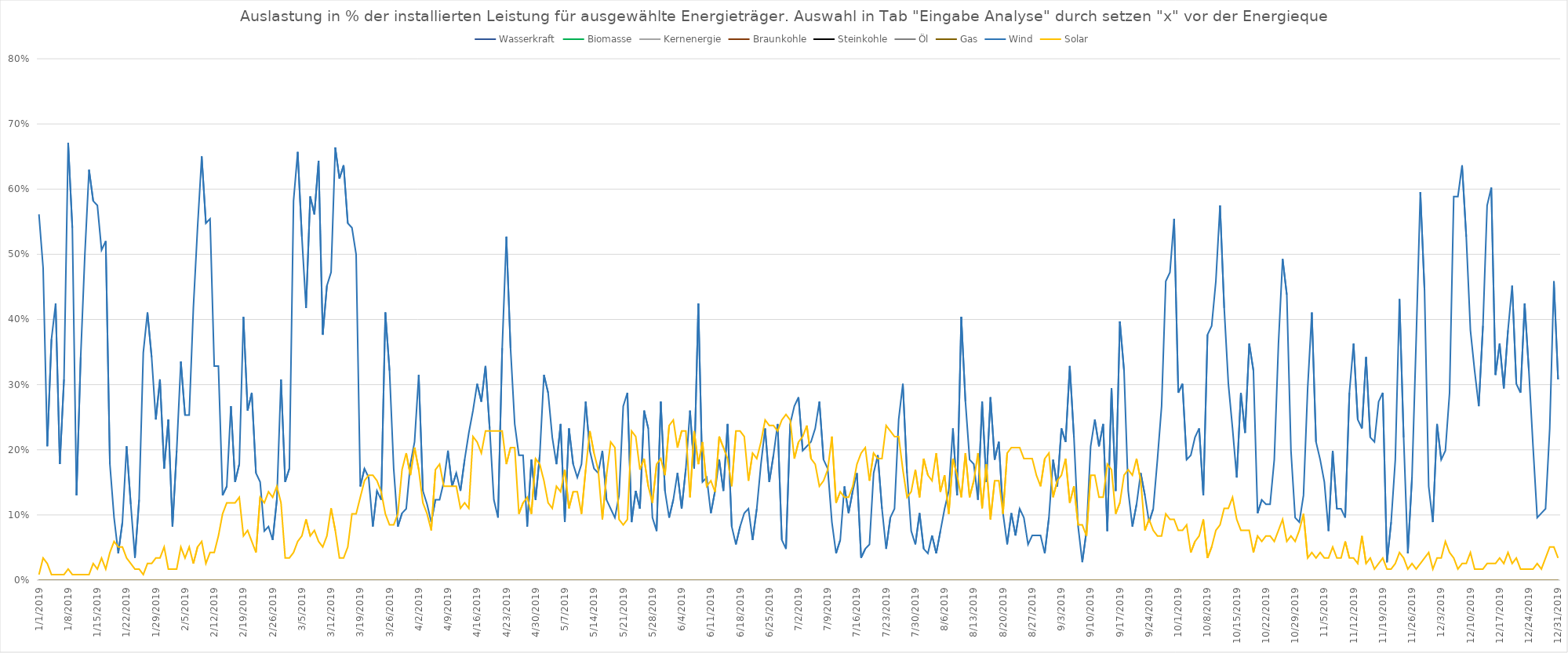
| Category | Wasserkraft | Biomasse | Kernenergie | Braunkohle | Steinkohle | Öl | Gas | Wind | Solar |
|---|---|---|---|---|---|---|---|---|---|
| 1/1/19 | 0 | 0 | 0 | 0 | 0 | 0 | 0 | 0.561 | 0.008 |
| 1/2/19 | 0 | 0 | 0 | 0 | 0 | 0 | 0 | 0.479 | 0.034 |
| 1/3/19 | 0 | 0 | 0 | 0 | 0 | 0 | 0 | 0.205 | 0.025 |
| 1/4/19 | 0 | 0 | 0 | 0 | 0 | 0 | 0 | 0.37 | 0.008 |
| 1/5/19 | 0 | 0 | 0 | 0 | 0 | 0 | 0 | 0.424 | 0.008 |
| 1/6/19 | 0 | 0 | 0 | 0 | 0 | 0 | 0 | 0.178 | 0.008 |
| 1/7/19 | 0 | 0 | 0 | 0 | 0 | 0 | 0 | 0.308 | 0.008 |
| 1/8/19 | 0 | 0 | 0 | 0 | 0 | 0 | 0 | 0.671 | 0.017 |
| 1/9/19 | 0 | 0 | 0 | 0 | 0 | 0 | 0 | 0.541 | 0.008 |
| 1/10/19 | 0 | 0 | 0 | 0 | 0 | 0 | 0 | 0.13 | 0.008 |
| 1/11/19 | 0 | 0 | 0 | 0 | 0 | 0 | 0 | 0.342 | 0.008 |
| 1/12/19 | 0 | 0 | 0 | 0 | 0 | 0 | 0 | 0.5 | 0.008 |
| 1/13/19 | 0 | 0 | 0 | 0 | 0 | 0 | 0 | 0.63 | 0.008 |
| 1/14/19 | 0 | 0 | 0 | 0 | 0 | 0 | 0 | 0.582 | 0.025 |
| 1/15/19 | 0 | 0 | 0 | 0 | 0 | 0 | 0 | 0.575 | 0.017 |
| 1/16/19 | 0 | 0 | 0 | 0 | 0 | 0 | 0 | 0.507 | 0.034 |
| 1/17/19 | 0 | 0 | 0 | 0 | 0 | 0 | 0 | 0.52 | 0.017 |
| 1/18/19 | 0 | 0 | 0 | 0 | 0 | 0 | 0 | 0.178 | 0.042 |
| 1/19/19 | 0 | 0 | 0 | 0 | 0 | 0 | 0 | 0.096 | 0.059 |
| 1/20/19 | 0 | 0 | 0 | 0 | 0 | 0 | 0 | 0.041 | 0.051 |
| 1/21/19 | 0 | 0 | 0 | 0 | 0 | 0 | 0 | 0.089 | 0.051 |
| 1/22/19 | 0 | 0 | 0 | 0 | 0 | 0 | 0 | 0.205 | 0.034 |
| 1/23/19 | 0 | 0 | 0 | 0 | 0 | 0 | 0 | 0.116 | 0.025 |
| 1/24/19 | 0 | 0 | 0 | 0 | 0 | 0 | 0 | 0.034 | 0.017 |
| 1/25/19 | 0 | 0 | 0 | 0 | 0 | 0 | 0 | 0.123 | 0.017 |
| 1/26/19 | 0 | 0 | 0 | 0 | 0 | 0 | 0 | 0.349 | 0.008 |
| 1/27/19 | 0 | 0 | 0 | 0 | 0 | 0 | 0 | 0.411 | 0.025 |
| 1/28/19 | 0 | 0 | 0 | 0 | 0 | 0 | 0 | 0.342 | 0.025 |
| 1/29/19 | 0 | 0 | 0 | 0 | 0 | 0 | 0 | 0.246 | 0.034 |
| 1/30/19 | 0 | 0 | 0 | 0 | 0 | 0 | 0 | 0.308 | 0.034 |
| 1/31/19 | 0 | 0 | 0 | 0 | 0 | 0 | 0 | 0.171 | 0.051 |
| 2/1/19 | 0 | 0 | 0 | 0 | 0 | 0 | 0 | 0.246 | 0.017 |
| 2/2/19 | 0 | 0 | 0 | 0 | 0 | 0 | 0 | 0.082 | 0.017 |
| 2/3/19 | 0 | 0 | 0 | 0 | 0 | 0 | 0 | 0.199 | 0.017 |
| 2/4/19 | 0 | 0 | 0 | 0 | 0 | 0 | 0 | 0.335 | 0.051 |
| 2/5/19 | 0 | 0 | 0 | 0 | 0 | 0 | 0 | 0.253 | 0.034 |
| 2/6/19 | 0 | 0 | 0 | 0 | 0 | 0 | 0 | 0.253 | 0.051 |
| 2/7/19 | 0 | 0 | 0 | 0 | 0 | 0 | 0 | 0.418 | 0.025 |
| 2/8/19 | 0 | 0 | 0 | 0 | 0 | 0 | 0 | 0.541 | 0.051 |
| 2/9/19 | 0 | 0 | 0 | 0 | 0 | 0 | 0 | 0.65 | 0.059 |
| 2/10/19 | 0 | 0 | 0 | 0 | 0 | 0 | 0 | 0.548 | 0.025 |
| 2/11/19 | 0 | 0 | 0 | 0 | 0 | 0 | 0 | 0.554 | 0.042 |
| 2/12/19 | 0 | 0 | 0 | 0 | 0 | 0 | 0 | 0.329 | 0.042 |
| 2/13/19 | 0 | 0 | 0 | 0 | 0 | 0 | 0 | 0.329 | 0.068 |
| 2/14/19 | 0 | 0 | 0 | 0 | 0 | 0 | 0 | 0.13 | 0.102 |
| 2/15/19 | 0 | 0 | 0 | 0 | 0 | 0 | 0 | 0.144 | 0.119 |
| 2/16/19 | 0 | 0 | 0 | 0 | 0 | 0 | 0 | 0.267 | 0.119 |
| 2/17/19 | 0 | 0 | 0 | 0 | 0 | 0 | 0 | 0.151 | 0.119 |
| 2/18/19 | 0 | 0 | 0 | 0 | 0 | 0 | 0 | 0.178 | 0.127 |
| 2/19/19 | 0 | 0 | 0 | 0 | 0 | 0 | 0 | 0.404 | 0.068 |
| 2/20/19 | 0 | 0 | 0 | 0 | 0 | 0 | 0 | 0.26 | 0.076 |
| 2/21/19 | 0 | 0 | 0 | 0 | 0 | 0 | 0 | 0.287 | 0.059 |
| 2/22/19 | 0 | 0 | 0 | 0 | 0 | 0 | 0 | 0.164 | 0.042 |
| 2/23/19 | 0 | 0 | 0 | 0 | 0 | 0 | 0 | 0.151 | 0.127 |
| 2/24/19 | 0 | 0 | 0 | 0 | 0 | 0 | 0 | 0.075 | 0.119 |
| 2/25/19 | 0 | 0 | 0 | 0 | 0 | 0 | 0 | 0.082 | 0.136 |
| 2/26/19 | 0 | 0 | 0 | 0 | 0 | 0 | 0 | 0.062 | 0.127 |
| 2/27/19 | 0 | 0 | 0 | 0 | 0 | 0 | 0 | 0.123 | 0.144 |
| 2/28/19 | 0 | 0 | 0 | 0 | 0 | 0 | 0 | 0.308 | 0.119 |
| 3/1/19 | 0 | 0 | 0 | 0 | 0 | 0 | 0 | 0.151 | 0.034 |
| 3/2/19 | 0 | 0 | 0 | 0 | 0 | 0 | 0 | 0.171 | 0.034 |
| 3/3/19 | 0 | 0 | 0 | 0 | 0 | 0 | 0 | 0.582 | 0.042 |
| 3/4/19 | 0 | 0 | 0 | 0 | 0 | 0 | 0 | 0.657 | 0.059 |
| 3/5/19 | 0 | 0 | 0 | 0 | 0 | 0 | 0 | 0.527 | 0.068 |
| 3/6/19 | 0 | 0 | 0 | 0 | 0 | 0 | 0 | 0.418 | 0.093 |
| 3/7/19 | 0 | 0 | 0 | 0 | 0 | 0 | 0 | 0.589 | 0.068 |
| 3/8/19 | 0 | 0 | 0 | 0 | 0 | 0 | 0 | 0.561 | 0.076 |
| 3/9/19 | 0 | 0 | 0 | 0 | 0 | 0 | 0 | 0.643 | 0.059 |
| 3/10/19 | 0 | 0 | 0 | 0 | 0 | 0 | 0 | 0.376 | 0.051 |
| 3/11/19 | 0 | 0 | 0 | 0 | 0 | 0 | 0 | 0.452 | 0.068 |
| 3/12/19 | 0 | 0 | 0 | 0 | 0 | 0 | 0 | 0.472 | 0.11 |
| 3/13/19 | 0 | 0 | 0 | 0 | 0 | 0 | 0 | 0.664 | 0.076 |
| 3/14/19 | 0 | 0 | 0 | 0 | 0 | 0 | 0 | 0.616 | 0.034 |
| 3/15/19 | 0 | 0 | 0 | 0 | 0 | 0 | 0 | 0.637 | 0.034 |
| 3/16/19 | 0 | 0 | 0 | 0 | 0 | 0 | 0 | 0.548 | 0.051 |
| 3/17/19 | 0 | 0 | 0 | 0 | 0 | 0 | 0 | 0.541 | 0.102 |
| 3/18/19 | 0 | 0 | 0 | 0 | 0 | 0 | 0 | 0.5 | 0.102 |
| 3/19/19 | 0 | 0 | 0 | 0 | 0 | 0 | 0 | 0.144 | 0.127 |
| 3/20/19 | 0 | 0 | 0 | 0 | 0 | 0 | 0 | 0.171 | 0.153 |
| 3/21/19 | 0 | 0 | 0 | 0 | 0 | 0 | 0 | 0.157 | 0.161 |
| 3/22/19 | 0 | 0 | 0 | 0 | 0 | 0 | 0 | 0.082 | 0.161 |
| 3/23/19 | 0 | 0 | 0 | 0 | 0 | 0 | 0 | 0.137 | 0.153 |
| 3/24/19 | 0 | 0 | 0 | 0 | 0 | 0 | 0 | 0.123 | 0.136 |
| 3/25/19 | 0 | 0 | 0 | 0 | 0 | 0 | 0 | 0.411 | 0.102 |
| 3/26/19 | 0 | 0 | 0 | 0 | 0 | 0 | 0 | 0.322 | 0.085 |
| 3/27/19 | 0 | 0 | 0 | 0 | 0 | 0 | 0 | 0.171 | 0.085 |
| 3/28/19 | 0 | 0 | 0 | 0 | 0 | 0 | 0 | 0.082 | 0.102 |
| 3/29/19 | 0 | 0 | 0 | 0 | 0 | 0 | 0 | 0.103 | 0.169 |
| 3/30/19 | 0 | 0 | 0 | 0 | 0 | 0 | 0 | 0.11 | 0.195 |
| 3/31/19 | 0 | 0 | 0 | 0 | 0 | 0 | 0 | 0.178 | 0.161 |
| 4/1/19 | 0 | 0 | 0 | 0 | 0 | 0 | 0 | 0.212 | 0.203 |
| 4/2/19 | 0 | 0 | 0 | 0 | 0 | 0 | 0 | 0.315 | 0.169 |
| 4/3/19 | 0 | 0 | 0 | 0 | 0 | 0 | 0 | 0.137 | 0.119 |
| 4/4/19 | 0 | 0 | 0 | 0 | 0 | 0 | 0 | 0.116 | 0.102 |
| 4/5/19 | 0 | 0 | 0 | 0 | 0 | 0 | 0 | 0.089 | 0.076 |
| 4/6/19 | 0 | 0 | 0 | 0 | 0 | 0 | 0 | 0.123 | 0.169 |
| 4/7/19 | 0 | 0 | 0 | 0 | 0 | 0 | 0 | 0.123 | 0.178 |
| 4/8/19 | 0 | 0 | 0 | 0 | 0 | 0 | 0 | 0.151 | 0.144 |
| 4/9/19 | 0 | 0 | 0 | 0 | 0 | 0 | 0 | 0.199 | 0.144 |
| 4/10/19 | 0 | 0 | 0 | 0 | 0 | 0 | 0 | 0.144 | 0.144 |
| 4/11/19 | 0 | 0 | 0 | 0 | 0 | 0 | 0 | 0.164 | 0.144 |
| 4/12/19 | 0 | 0 | 0 | 0 | 0 | 0 | 0 | 0.137 | 0.11 |
| 4/13/19 | 0 | 0 | 0 | 0 | 0 | 0 | 0 | 0.185 | 0.119 |
| 4/14/19 | 0 | 0 | 0 | 0 | 0 | 0 | 0 | 0.226 | 0.11 |
| 4/15/19 | 0 | 0 | 0 | 0 | 0 | 0 | 0 | 0.26 | 0.22 |
| 4/16/19 | 0 | 0 | 0 | 0 | 0 | 0 | 0 | 0.301 | 0.212 |
| 4/17/19 | 0 | 0 | 0 | 0 | 0 | 0 | 0 | 0.274 | 0.195 |
| 4/18/19 | 0 | 0 | 0 | 0 | 0 | 0 | 0 | 0.329 | 0.229 |
| 4/19/19 | 0 | 0 | 0 | 0 | 0 | 0 | 0 | 0.233 | 0.229 |
| 4/20/19 | 0 | 0 | 0 | 0 | 0 | 0 | 0 | 0.123 | 0.229 |
| 4/21/19 | 0 | 0 | 0 | 0 | 0 | 0 | 0 | 0.096 | 0.229 |
| 4/22/19 | 0 | 0 | 0 | 0 | 0 | 0 | 0 | 0.356 | 0.229 |
| 4/23/19 | 0 | 0 | 0 | 0 | 0 | 0 | 0 | 0.527 | 0.178 |
| 4/24/19 | 0 | 0 | 0 | 0 | 0 | 0 | 0 | 0.356 | 0.203 |
| 4/25/19 | 0 | 0 | 0 | 0 | 0 | 0 | 0 | 0.24 | 0.203 |
| 4/26/19 | 0 | 0 | 0 | 0 | 0 | 0 | 0 | 0.192 | 0.102 |
| 4/27/19 | 0 | 0 | 0 | 0 | 0 | 0 | 0 | 0.192 | 0.119 |
| 4/28/19 | 0 | 0 | 0 | 0 | 0 | 0 | 0 | 0.082 | 0.127 |
| 4/29/19 | 0 | 0 | 0 | 0 | 0 | 0 | 0 | 0.185 | 0.102 |
| 4/30/19 | 0 | 0 | 0 | 0 | 0 | 0 | 0 | 0.123 | 0.186 |
| 5/1/19 | 0 | 0 | 0 | 0 | 0 | 0 | 0 | 0.192 | 0.178 |
| 5/2/19 | 0 | 0 | 0 | 0 | 0 | 0 | 0 | 0.315 | 0.153 |
| 5/3/19 | 0 | 0 | 0 | 0 | 0 | 0 | 0 | 0.287 | 0.119 |
| 5/4/19 | 0 | 0 | 0 | 0 | 0 | 0 | 0 | 0.219 | 0.11 |
| 5/5/19 | 0 | 0 | 0 | 0 | 0 | 0 | 0 | 0.178 | 0.144 |
| 5/6/19 | 0 | 0 | 0 | 0 | 0 | 0 | 0 | 0.24 | 0.136 |
| 5/7/19 | 0 | 0 | 0 | 0 | 0 | 0 | 0 | 0.089 | 0.169 |
| 5/8/19 | 0 | 0 | 0 | 0 | 0 | 0 | 0 | 0.233 | 0.11 |
| 5/9/19 | 0 | 0 | 0 | 0 | 0 | 0 | 0 | 0.178 | 0.136 |
| 5/10/19 | 0 | 0 | 0 | 0 | 0 | 0 | 0 | 0.157 | 0.136 |
| 5/11/19 | 0 | 0 | 0 | 0 | 0 | 0 | 0 | 0.178 | 0.102 |
| 5/12/19 | 0 | 0 | 0 | 0 | 0 | 0 | 0 | 0.274 | 0.169 |
| 5/13/19 | 0 | 0 | 0 | 0 | 0 | 0 | 0 | 0.199 | 0.229 |
| 5/14/19 | 0 | 0 | 0 | 0 | 0 | 0 | 0 | 0.171 | 0.195 |
| 5/15/19 | 0 | 0 | 0 | 0 | 0 | 0 | 0 | 0.164 | 0.169 |
| 5/16/19 | 0 | 0 | 0 | 0 | 0 | 0 | 0 | 0.199 | 0.093 |
| 5/17/19 | 0 | 0 | 0 | 0 | 0 | 0 | 0 | 0.123 | 0.161 |
| 5/18/19 | 0 | 0 | 0 | 0 | 0 | 0 | 0 | 0.11 | 0.212 |
| 5/19/19 | 0 | 0 | 0 | 0 | 0 | 0 | 0 | 0.096 | 0.203 |
| 5/20/19 | 0 | 0 | 0 | 0 | 0 | 0 | 0 | 0.13 | 0.093 |
| 5/21/19 | 0 | 0 | 0 | 0 | 0 | 0 | 0 | 0.267 | 0.085 |
| 5/22/19 | 0 | 0 | 0 | 0 | 0 | 0 | 0 | 0.287 | 0.093 |
| 5/23/19 | 0 | 0 | 0 | 0 | 0 | 0 | 0 | 0.089 | 0.229 |
| 5/24/19 | 0 | 0 | 0 | 0 | 0 | 0 | 0 | 0.137 | 0.22 |
| 5/25/19 | 0 | 0 | 0 | 0 | 0 | 0 | 0 | 0.11 | 0.169 |
| 5/26/19 | 0 | 0 | 0 | 0 | 0 | 0 | 0 | 0.26 | 0.186 |
| 5/27/19 | 0 | 0 | 0 | 0 | 0 | 0 | 0 | 0.233 | 0.144 |
| 5/28/19 | 0 | 0 | 0 | 0 | 0 | 0 | 0 | 0.096 | 0.119 |
| 5/29/19 | 0 | 0 | 0 | 0 | 0 | 0 | 0 | 0.075 | 0.178 |
| 5/30/19 | 0 | 0 | 0 | 0 | 0 | 0 | 0 | 0.274 | 0.186 |
| 5/31/19 | 0 | 0 | 0 | 0 | 0 | 0 | 0 | 0.137 | 0.161 |
| 6/1/19 | 0 | 0 | 0 | 0 | 0 | 0 | 0 | 0.096 | 0.237 |
| 6/2/19 | 0 | 0 | 0 | 0 | 0 | 0 | 0 | 0.123 | 0.246 |
| 6/3/19 | 0 | 0 | 0 | 0 | 0 | 0 | 0 | 0.164 | 0.203 |
| 6/4/19 | 0 | 0 | 0 | 0 | 0 | 0 | 0 | 0.11 | 0.229 |
| 6/5/19 | 0 | 0 | 0 | 0 | 0 | 0 | 0 | 0.171 | 0.229 |
| 6/6/19 | 0 | 0 | 0 | 0 | 0 | 0 | 0 | 0.26 | 0.127 |
| 6/7/19 | 0 | 0 | 0 | 0 | 0 | 0 | 0 | 0.171 | 0.229 |
| 6/8/19 | 0 | 0 | 0 | 0 | 0 | 0 | 0 | 0.424 | 0.178 |
| 6/9/19 | 0 | 0 | 0 | 0 | 0 | 0 | 0 | 0.151 | 0.212 |
| 6/10/19 | 0 | 0 | 0 | 0 | 0 | 0 | 0 | 0.157 | 0.144 |
| 6/11/19 | 0 | 0 | 0 | 0 | 0 | 0 | 0 | 0.103 | 0.153 |
| 6/12/19 | 0 | 0 | 0 | 0 | 0 | 0 | 0 | 0.137 | 0.136 |
| 6/13/19 | 0 | 0 | 0 | 0 | 0 | 0 | 0 | 0.185 | 0.22 |
| 6/14/19 | 0 | 0 | 0 | 0 | 0 | 0 | 0 | 0.137 | 0.203 |
| 6/15/19 | 0 | 0 | 0 | 0 | 0 | 0 | 0 | 0.24 | 0.186 |
| 6/16/19 | 0 | 0 | 0 | 0 | 0 | 0 | 0 | 0.082 | 0.144 |
| 6/17/19 | 0 | 0 | 0 | 0 | 0 | 0 | 0 | 0.055 | 0.229 |
| 6/18/19 | 0 | 0 | 0 | 0 | 0 | 0 | 0 | 0.082 | 0.229 |
| 6/19/19 | 0 | 0 | 0 | 0 | 0 | 0 | 0 | 0.103 | 0.22 |
| 6/20/19 | 0 | 0 | 0 | 0 | 0 | 0 | 0 | 0.11 | 0.153 |
| 6/21/19 | 0 | 0 | 0 | 0 | 0 | 0 | 0 | 0.062 | 0.195 |
| 6/22/19 | 0 | 0 | 0 | 0 | 0 | 0 | 0 | 0.11 | 0.186 |
| 6/23/19 | 0 | 0 | 0 | 0 | 0 | 0 | 0 | 0.178 | 0.212 |
| 6/24/19 | 0 | 0 | 0 | 0 | 0 | 0 | 0 | 0.233 | 0.246 |
| 6/25/19 | 0 | 0 | 0 | 0 | 0 | 0 | 0 | 0.151 | 0.237 |
| 6/26/19 | 0 | 0 | 0 | 0 | 0 | 0 | 0 | 0.192 | 0.237 |
| 6/27/19 | 0 | 0 | 0 | 0 | 0 | 0 | 0 | 0.24 | 0.229 |
| 6/28/19 | 0 | 0 | 0 | 0 | 0 | 0 | 0 | 0.062 | 0.246 |
| 6/29/19 | 0 | 0 | 0 | 0 | 0 | 0 | 0 | 0.048 | 0.254 |
| 6/30/19 | 0 | 0 | 0 | 0 | 0 | 0 | 0 | 0.24 | 0.246 |
| 7/1/19 | 0 | 0 | 0 | 0 | 0 | 0 | 0 | 0.267 | 0.186 |
| 7/2/19 | 0 | 0 | 0 | 0 | 0 | 0 | 0 | 0.281 | 0.212 |
| 7/3/19 | 0 | 0 | 0 | 0 | 0 | 0 | 0 | 0.199 | 0.22 |
| 7/4/19 | 0 | 0 | 0 | 0 | 0 | 0 | 0 | 0.205 | 0.237 |
| 7/5/19 | 0 | 0 | 0 | 0 | 0 | 0 | 0 | 0.212 | 0.186 |
| 7/6/19 | 0 | 0 | 0 | 0 | 0 | 0 | 0 | 0.233 | 0.178 |
| 7/7/19 | 0 | 0 | 0 | 0 | 0 | 0 | 0 | 0.274 | 0.144 |
| 7/8/19 | 0 | 0 | 0 | 0 | 0 | 0 | 0 | 0.185 | 0.153 |
| 7/9/19 | 0 | 0 | 0 | 0 | 0 | 0 | 0 | 0.171 | 0.169 |
| 7/10/19 | 0 | 0 | 0 | 0 | 0 | 0 | 0 | 0.089 | 0.22 |
| 7/11/19 | 0 | 0 | 0 | 0 | 0 | 0 | 0 | 0.041 | 0.119 |
| 7/12/19 | 0 | 0 | 0 | 0 | 0 | 0 | 0 | 0.062 | 0.136 |
| 7/13/19 | 0 | 0 | 0 | 0 | 0 | 0 | 0 | 0.144 | 0.127 |
| 7/14/19 | 0 | 0 | 0 | 0 | 0 | 0 | 0 | 0.103 | 0.127 |
| 7/15/19 | 0 | 0 | 0 | 0 | 0 | 0 | 0 | 0.137 | 0.144 |
| 7/16/19 | 0 | 0 | 0 | 0 | 0 | 0 | 0 | 0.164 | 0.178 |
| 7/17/19 | 0 | 0 | 0 | 0 | 0 | 0 | 0 | 0.034 | 0.195 |
| 7/18/19 | 0 | 0 | 0 | 0 | 0 | 0 | 0 | 0.048 | 0.203 |
| 7/19/19 | 0 | 0 | 0 | 0 | 0 | 0 | 0 | 0.055 | 0.153 |
| 7/20/19 | 0 | 0 | 0 | 0 | 0 | 0 | 0 | 0.164 | 0.195 |
| 7/21/19 | 0 | 0 | 0 | 0 | 0 | 0 | 0 | 0.192 | 0.186 |
| 7/22/19 | 0 | 0 | 0 | 0 | 0 | 0 | 0 | 0.11 | 0.186 |
| 7/23/19 | 0 | 0 | 0 | 0 | 0 | 0 | 0 | 0.048 | 0.237 |
| 7/24/19 | 0 | 0 | 0 | 0 | 0 | 0 | 0 | 0.096 | 0.229 |
| 7/25/19 | 0 | 0 | 0 | 0 | 0 | 0 | 0 | 0.11 | 0.22 |
| 7/26/19 | 0 | 0 | 0 | 0 | 0 | 0 | 0 | 0.246 | 0.22 |
| 7/27/19 | 0 | 0 | 0 | 0 | 0 | 0 | 0 | 0.301 | 0.169 |
| 7/28/19 | 0 | 0 | 0 | 0 | 0 | 0 | 0 | 0.164 | 0.127 |
| 7/29/19 | 0 | 0 | 0 | 0 | 0 | 0 | 0 | 0.075 | 0.136 |
| 7/30/19 | 0 | 0 | 0 | 0 | 0 | 0 | 0 | 0.055 | 0.169 |
| 7/31/19 | 0 | 0 | 0 | 0 | 0 | 0 | 0 | 0.103 | 0.127 |
| 8/1/19 | 0 | 0 | 0 | 0 | 0 | 0 | 0 | 0.048 | 0.186 |
| 8/2/19 | 0 | 0 | 0 | 0 | 0 | 0 | 0 | 0.041 | 0.161 |
| 8/3/19 | 0 | 0 | 0 | 0 | 0 | 0 | 0 | 0.068 | 0.153 |
| 8/4/19 | 0 | 0 | 0 | 0 | 0 | 0 | 0 | 0.041 | 0.195 |
| 8/5/19 | 0 | 0 | 0 | 0 | 0 | 0 | 0 | 0.075 | 0.136 |
| 8/6/19 | 0 | 0 | 0 | 0 | 0 | 0 | 0 | 0.11 | 0.161 |
| 8/7/19 | 0 | 0 | 0 | 0 | 0 | 0 | 0 | 0.137 | 0.102 |
| 8/8/19 | 0 | 0 | 0 | 0 | 0 | 0 | 0 | 0.233 | 0.186 |
| 8/9/19 | 0 | 0 | 0 | 0 | 0 | 0 | 0 | 0.13 | 0.161 |
| 8/10/19 | 0 | 0 | 0 | 0 | 0 | 0 | 0 | 0.404 | 0.127 |
| 8/11/19 | 0 | 0 | 0 | 0 | 0 | 0 | 0 | 0.274 | 0.195 |
| 8/12/19 | 0 | 0 | 0 | 0 | 0 | 0 | 0 | 0.185 | 0.127 |
| 8/13/19 | 0 | 0 | 0 | 0 | 0 | 0 | 0 | 0.178 | 0.153 |
| 8/14/19 | 0 | 0 | 0 | 0 | 0 | 0 | 0 | 0.123 | 0.195 |
| 8/15/19 | 0 | 0 | 0 | 0 | 0 | 0 | 0 | 0.274 | 0.11 |
| 8/16/19 | 0 | 0 | 0 | 0 | 0 | 0 | 0 | 0.151 | 0.178 |
| 8/17/19 | 0 | 0 | 0 | 0 | 0 | 0 | 0 | 0.281 | 0.093 |
| 8/18/19 | 0 | 0 | 0 | 0 | 0 | 0 | 0 | 0.185 | 0.153 |
| 8/19/19 | 0 | 0 | 0 | 0 | 0 | 0 | 0 | 0.212 | 0.153 |
| 8/20/19 | 0 | 0 | 0 | 0 | 0 | 0 | 0 | 0.103 | 0.102 |
| 8/21/19 | 0 | 0 | 0 | 0 | 0 | 0 | 0 | 0.055 | 0.195 |
| 8/22/19 | 0 | 0 | 0 | 0 | 0 | 0 | 0 | 0.103 | 0.203 |
| 8/23/19 | 0 | 0 | 0 | 0 | 0 | 0 | 0 | 0.068 | 0.203 |
| 8/24/19 | 0 | 0 | 0 | 0 | 0 | 0 | 0 | 0.11 | 0.203 |
| 8/25/19 | 0 | 0 | 0 | 0 | 0 | 0 | 0 | 0.096 | 0.186 |
| 8/26/19 | 0 | 0 | 0 | 0 | 0 | 0 | 0 | 0.055 | 0.186 |
| 8/27/19 | 0 | 0 | 0 | 0 | 0 | 0 | 0 | 0.068 | 0.186 |
| 8/28/19 | 0 | 0 | 0 | 0 | 0 | 0 | 0 | 0.068 | 0.161 |
| 8/29/19 | 0 | 0 | 0 | 0 | 0 | 0 | 0 | 0.068 | 0.144 |
| 8/30/19 | 0 | 0 | 0 | 0 | 0 | 0 | 0 | 0.041 | 0.186 |
| 8/31/19 | 0 | 0 | 0 | 0 | 0 | 0 | 0 | 0.096 | 0.195 |
| 9/1/19 | 0 | 0 | 0 | 0 | 0 | 0 | 0 | 0.185 | 0.127 |
| 9/2/19 | 0 | 0 | 0 | 0 | 0 | 0 | 0 | 0.144 | 0.153 |
| 9/3/19 | 0 | 0 | 0 | 0 | 0 | 0 | 0 | 0.233 | 0.161 |
| 9/4/19 | 0 | 0 | 0 | 0 | 0 | 0 | 0 | 0.212 | 0.186 |
| 9/5/19 | 0 | 0 | 0 | 0 | 0 | 0 | 0 | 0.329 | 0.119 |
| 9/6/19 | 0 | 0 | 0 | 0 | 0 | 0 | 0 | 0.219 | 0.144 |
| 9/7/19 | 0 | 0 | 0 | 0 | 0 | 0 | 0 | 0.082 | 0.085 |
| 9/8/19 | 0 | 0 | 0 | 0 | 0 | 0 | 0 | 0.027 | 0.085 |
| 9/9/19 | 0 | 0 | 0 | 0 | 0 | 0 | 0 | 0.075 | 0.068 |
| 9/10/19 | 0 | 0 | 0 | 0 | 0 | 0 | 0 | 0.205 | 0.161 |
| 9/11/19 | 0 | 0 | 0 | 0 | 0 | 0 | 0 | 0.246 | 0.161 |
| 9/12/19 | 0 | 0 | 0 | 0 | 0 | 0 | 0 | 0.205 | 0.127 |
| 9/13/19 | 0 | 0 | 0 | 0 | 0 | 0 | 0 | 0.24 | 0.127 |
| 9/14/19 | 0 | 0 | 0 | 0 | 0 | 0 | 0 | 0.075 | 0.178 |
| 9/15/19 | 0 | 0 | 0 | 0 | 0 | 0 | 0 | 0.294 | 0.169 |
| 9/16/19 | 0 | 0 | 0 | 0 | 0 | 0 | 0 | 0.137 | 0.102 |
| 9/17/19 | 0 | 0 | 0 | 0 | 0 | 0 | 0 | 0.397 | 0.119 |
| 9/18/19 | 0 | 0 | 0 | 0 | 0 | 0 | 0 | 0.322 | 0.161 |
| 9/19/19 | 0 | 0 | 0 | 0 | 0 | 0 | 0 | 0.137 | 0.169 |
| 9/20/19 | 0 | 0 | 0 | 0 | 0 | 0 | 0 | 0.082 | 0.161 |
| 9/21/19 | 0 | 0 | 0 | 0 | 0 | 0 | 0 | 0.116 | 0.186 |
| 9/22/19 | 0 | 0 | 0 | 0 | 0 | 0 | 0 | 0.164 | 0.153 |
| 9/23/19 | 0 | 0 | 0 | 0 | 0 | 0 | 0 | 0.13 | 0.076 |
| 9/24/19 | 0 | 0 | 0 | 0 | 0 | 0 | 0 | 0.089 | 0.093 |
| 9/25/19 | 0 | 0 | 0 | 0 | 0 | 0 | 0 | 0.11 | 0.076 |
| 9/26/19 | 0 | 0 | 0 | 0 | 0 | 0 | 0 | 0.185 | 0.068 |
| 9/27/19 | 0 | 0 | 0 | 0 | 0 | 0 | 0 | 0.267 | 0.068 |
| 9/28/19 | 0 | 0 | 0 | 0 | 0 | 0 | 0 | 0.459 | 0.102 |
| 9/29/19 | 0 | 0 | 0 | 0 | 0 | 0 | 0 | 0.472 | 0.093 |
| 9/30/19 | 0 | 0 | 0 | 0 | 0 | 0 | 0 | 0.554 | 0.093 |
| 10/1/19 | 0 | 0 | 0 | 0 | 0 | 0 | 0 | 0.287 | 0.076 |
| 10/2/19 | 0 | 0 | 0 | 0 | 0 | 0 | 0 | 0.301 | 0.076 |
| 10/3/19 | 0 | 0 | 0 | 0 | 0 | 0 | 0 | 0.185 | 0.085 |
| 10/4/19 | 0 | 0 | 0 | 0 | 0 | 0 | 0 | 0.192 | 0.042 |
| 10/5/19 | 0 | 0 | 0 | 0 | 0 | 0 | 0 | 0.219 | 0.059 |
| 10/6/19 | 0 | 0 | 0 | 0 | 0 | 0 | 0 | 0.233 | 0.068 |
| 10/7/19 | 0 | 0 | 0 | 0 | 0 | 0 | 0 | 0.13 | 0.093 |
| 10/8/19 | 0 | 0 | 0 | 0 | 0 | 0 | 0 | 0.376 | 0.034 |
| 10/9/19 | 0 | 0 | 0 | 0 | 0 | 0 | 0 | 0.39 | 0.051 |
| 10/10/19 | 0 | 0 | 0 | 0 | 0 | 0 | 0 | 0.459 | 0.076 |
| 10/11/19 | 0 | 0 | 0 | 0 | 0 | 0 | 0 | 0.575 | 0.085 |
| 10/12/19 | 0 | 0 | 0 | 0 | 0 | 0 | 0 | 0.418 | 0.11 |
| 10/13/19 | 0 | 0 | 0 | 0 | 0 | 0 | 0 | 0.301 | 0.11 |
| 10/14/19 | 0 | 0 | 0 | 0 | 0 | 0 | 0 | 0.233 | 0.127 |
| 10/15/19 | 0 | 0 | 0 | 0 | 0 | 0 | 0 | 0.157 | 0.093 |
| 10/16/19 | 0 | 0 | 0 | 0 | 0 | 0 | 0 | 0.287 | 0.076 |
| 10/17/19 | 0 | 0 | 0 | 0 | 0 | 0 | 0 | 0.226 | 0.076 |
| 10/18/19 | 0 | 0 | 0 | 0 | 0 | 0 | 0 | 0.363 | 0.076 |
| 10/19/19 | 0 | 0 | 0 | 0 | 0 | 0 | 0 | 0.322 | 0.042 |
| 10/20/19 | 0 | 0 | 0 | 0 | 0 | 0 | 0 | 0.103 | 0.068 |
| 10/21/19 | 0 | 0 | 0 | 0 | 0 | 0 | 0 | 0.123 | 0.059 |
| 10/22/19 | 0 | 0 | 0 | 0 | 0 | 0 | 0 | 0.116 | 0.068 |
| 10/23/19 | 0 | 0 | 0 | 0 | 0 | 0 | 0 | 0.116 | 0.068 |
| 10/24/19 | 0 | 0 | 0 | 0 | 0 | 0 | 0 | 0.185 | 0.059 |
| 10/25/19 | 0 | 0 | 0 | 0 | 0 | 0 | 0 | 0.363 | 0.076 |
| 10/26/19 | 0 | 0 | 0 | 0 | 0 | 0 | 0 | 0.493 | 0.093 |
| 10/27/19 | 0 | 0 | 0 | 0 | 0 | 0 | 0 | 0.438 | 0.059 |
| 10/28/19 | 0 | 0 | 0 | 0 | 0 | 0 | 0 | 0.199 | 0.068 |
| 10/29/19 | 0 | 0 | 0 | 0 | 0 | 0 | 0 | 0.096 | 0.059 |
| 10/30/19 | 0 | 0 | 0 | 0 | 0 | 0 | 0 | 0.089 | 0.076 |
| 10/31/19 | 0 | 0 | 0 | 0 | 0 | 0 | 0 | 0.13 | 0.102 |
| 11/1/19 | 0 | 0 | 0 | 0 | 0 | 0 | 0 | 0.294 | 0.034 |
| 11/2/19 | 0 | 0 | 0 | 0 | 0 | 0 | 0 | 0.411 | 0.042 |
| 11/3/19 | 0 | 0 | 0 | 0 | 0 | 0 | 0 | 0.212 | 0.034 |
| 11/4/19 | 0 | 0 | 0 | 0 | 0 | 0 | 0 | 0.185 | 0.042 |
| 11/5/19 | 0 | 0 | 0 | 0 | 0 | 0 | 0 | 0.151 | 0.034 |
| 11/6/19 | 0 | 0 | 0 | 0 | 0 | 0 | 0 | 0.075 | 0.034 |
| 11/7/19 | 0 | 0 | 0 | 0 | 0 | 0 | 0 | 0.199 | 0.051 |
| 11/8/19 | 0 | 0 | 0 | 0 | 0 | 0 | 0 | 0.11 | 0.034 |
| 11/9/19 | 0 | 0 | 0 | 0 | 0 | 0 | 0 | 0.11 | 0.034 |
| 11/10/19 | 0 | 0 | 0 | 0 | 0 | 0 | 0 | 0.096 | 0.059 |
| 11/11/19 | 0 | 0 | 0 | 0 | 0 | 0 | 0 | 0.287 | 0.034 |
| 11/12/19 | 0 | 0 | 0 | 0 | 0 | 0 | 0 | 0.363 | 0.034 |
| 11/13/19 | 0 | 0 | 0 | 0 | 0 | 0 | 0 | 0.246 | 0.025 |
| 11/14/19 | 0 | 0 | 0 | 0 | 0 | 0 | 0 | 0.233 | 0.068 |
| 11/15/19 | 0 | 0 | 0 | 0 | 0 | 0 | 0 | 0.342 | 0.025 |
| 11/16/19 | 0 | 0 | 0 | 0 | 0 | 0 | 0 | 0.219 | 0.034 |
| 11/17/19 | 0 | 0 | 0 | 0 | 0 | 0 | 0 | 0.212 | 0.017 |
| 11/18/19 | 0 | 0 | 0 | 0 | 0 | 0 | 0 | 0.274 | 0.025 |
| 11/19/19 | 0 | 0 | 0 | 0 | 0 | 0 | 0 | 0.287 | 0.034 |
| 11/20/19 | 0 | 0 | 0 | 0 | 0 | 0 | 0 | 0.027 | 0.017 |
| 11/21/19 | 0 | 0 | 0 | 0 | 0 | 0 | 0 | 0.089 | 0.017 |
| 11/22/19 | 0 | 0 | 0 | 0 | 0 | 0 | 0 | 0.185 | 0.025 |
| 11/23/19 | 0 | 0 | 0 | 0 | 0 | 0 | 0 | 0.431 | 0.042 |
| 11/24/19 | 0 | 0 | 0 | 0 | 0 | 0 | 0 | 0.219 | 0.034 |
| 11/25/19 | 0 | 0 | 0 | 0 | 0 | 0 | 0 | 0.041 | 0.017 |
| 11/26/19 | 0 | 0 | 0 | 0 | 0 | 0 | 0 | 0.157 | 0.025 |
| 11/27/19 | 0 | 0 | 0 | 0 | 0 | 0 | 0 | 0.37 | 0.017 |
| 11/28/19 | 0 | 0 | 0 | 0 | 0 | 0 | 0 | 0.596 | 0.025 |
| 11/29/19 | 0 | 0 | 0 | 0 | 0 | 0 | 0 | 0.445 | 0.034 |
| 11/30/19 | 0 | 0 | 0 | 0 | 0 | 0 | 0 | 0.144 | 0.042 |
| 12/1/19 | 0 | 0 | 0 | 0 | 0 | 0 | 0 | 0.089 | 0.017 |
| 12/2/19 | 0 | 0 | 0 | 0 | 0 | 0 | 0 | 0.24 | 0.034 |
| 12/3/19 | 0 | 0 | 0 | 0 | 0 | 0 | 0 | 0.185 | 0.034 |
| 12/4/19 | 0 | 0 | 0 | 0 | 0 | 0 | 0 | 0.199 | 0.059 |
| 12/5/19 | 0 | 0 | 0 | 0 | 0 | 0 | 0 | 0.287 | 0.042 |
| 12/6/19 | 0 | 0 | 0 | 0 | 0 | 0 | 0 | 0.589 | 0.034 |
| 12/7/19 | 0 | 0 | 0 | 0 | 0 | 0 | 0 | 0.589 | 0.017 |
| 12/8/19 | 0 | 0 | 0 | 0 | 0 | 0 | 0 | 0.637 | 0.025 |
| 12/9/19 | 0 | 0 | 0 | 0 | 0 | 0 | 0 | 0.527 | 0.025 |
| 12/10/19 | 0 | 0 | 0 | 0 | 0 | 0 | 0 | 0.383 | 0.042 |
| 12/11/19 | 0 | 0 | 0 | 0 | 0 | 0 | 0 | 0.322 | 0.017 |
| 12/12/19 | 0 | 0 | 0 | 0 | 0 | 0 | 0 | 0.267 | 0.017 |
| 12/13/19 | 0 | 0 | 0 | 0 | 0 | 0 | 0 | 0.39 | 0.017 |
| 12/14/19 | 0 | 0 | 0 | 0 | 0 | 0 | 0 | 0.575 | 0.025 |
| 12/15/19 | 0 | 0 | 0 | 0 | 0 | 0 | 0 | 0.602 | 0.025 |
| 12/16/19 | 0 | 0 | 0 | 0 | 0 | 0 | 0 | 0.315 | 0.025 |
| 12/17/19 | 0 | 0 | 0 | 0 | 0 | 0 | 0 | 0.363 | 0.034 |
| 12/18/19 | 0 | 0 | 0 | 0 | 0 | 0 | 0 | 0.294 | 0.025 |
| 12/19/19 | 0 | 0 | 0 | 0 | 0 | 0 | 0 | 0.383 | 0.042 |
| 12/20/19 | 0 | 0 | 0 | 0 | 0 | 0 | 0 | 0.452 | 0.025 |
| 12/21/19 | 0 | 0 | 0 | 0 | 0 | 0 | 0 | 0.301 | 0.034 |
| 12/22/19 | 0 | 0 | 0 | 0 | 0 | 0 | 0 | 0.287 | 0.017 |
| 12/23/19 | 0 | 0 | 0 | 0 | 0 | 0 | 0 | 0.424 | 0.017 |
| 12/24/19 | 0 | 0 | 0 | 0 | 0 | 0 | 0 | 0.322 | 0.017 |
| 12/25/19 | 0 | 0 | 0 | 0 | 0 | 0 | 0 | 0.205 | 0.017 |
| 12/26/19 | 0 | 0 | 0 | 0 | 0 | 0 | 0 | 0.096 | 0.025 |
| 12/27/19 | 0 | 0 | 0 | 0 | 0 | 0 | 0 | 0.103 | 0.017 |
| 12/28/19 | 0 | 0 | 0 | 0 | 0 | 0 | 0 | 0.11 | 0.034 |
| 12/29/19 | 0 | 0 | 0 | 0 | 0 | 0 | 0 | 0.233 | 0.051 |
| 12/30/19 | 0 | 0 | 0 | 0 | 0 | 0 | 0 | 0.459 | 0.051 |
| 12/31/19 | 0 | 0 | 0 | 0 | 0 | 0 | 0 | 0.308 | 0.034 |